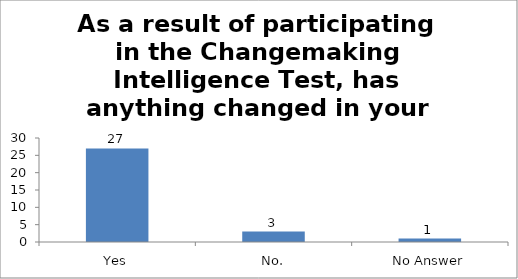
| Category | As a result of participating in the Changemaking Intelligence Test, has anything changed in your thinking or future plans? |
|---|---|
| Yes | 27 |
| No. | 3 |
| No Answer | 1 |